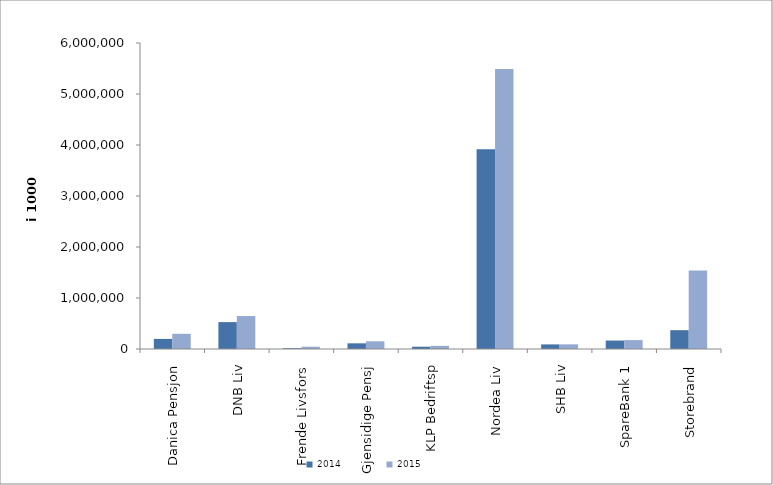
| Category | 2014 | 2015 |
|---|---|---|
| Danica Pensjon | 198038.339 | 297843.3 |
| DNB Liv | 527290 | 646194.664 |
| Frende Livsfors | 15301 | 44529 |
| Gjensidige Pensj | 111089.645 | 151008 |
| KLP Bedriftsp | 44818 | 62123 |
| Nordea Liv | 3915515 | 5489865.612 |
| SHB Liv | 90007 | 91161 |
| SpareBank 1 | 165677.651 | 174692.018 |
| Storebrand | 369290.254 | 1538451.312 |